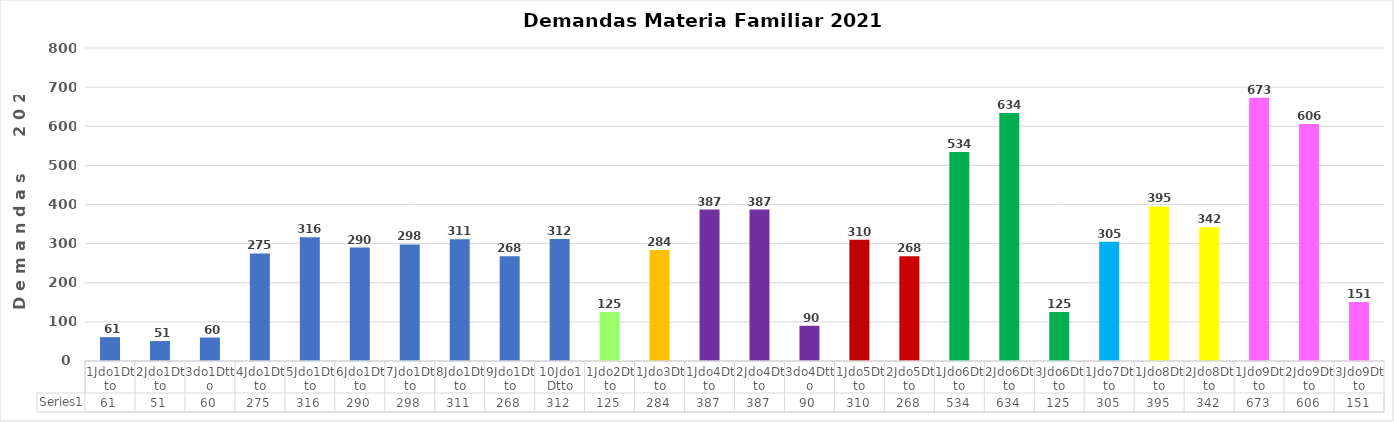
| Category | Series 0 |
|---|---|
| 1Jdo1Dtto | 61 |
| 2Jdo1Dtto | 51 |
| 3do1Dtto | 60 |
| 4Jdo1Dtto | 275 |
| 5Jdo1Dtto | 316 |
| 6Jdo1Dtto | 290 |
| 7Jdo1Dtto | 298 |
| 8Jdo1Dtto | 311 |
| 9Jdo1Dtto | 268 |
| 10Jdo1Dtto | 312 |
| 1Jdo2Dtto | 125 |
| 1Jdo3Dtto | 284 |
| 1Jdo4Dtto | 387 |
| 2Jdo4Dtto | 387 |
| 3do4Dtto | 90 |
| 1Jdo5Dtto | 310 |
| 2Jdo5Dtto | 268 |
| 1Jdo6Dtto | 534 |
| 2Jdo6Dtto | 634 |
| 3Jdo6Dtto | 125 |
| 1Jdo7Dtto | 305 |
| 1Jdo8Dtto | 395 |
| 2Jdo8Dtto | 342 |
| 1Jdo9Dtto | 673 |
| 2Jdo9Dtto | 606 |
| 3Jdo9Dtto | 151 |